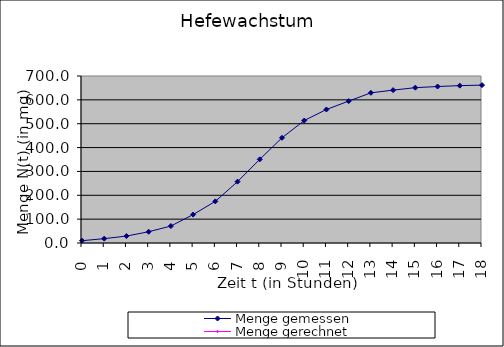
| Category | Menge gemessen | Menge gerechnet |
|---|---|---|
| 0.0 | 9.6 |  |
| 1.0 | 18.3 |  |
| 2.0 | 29 |  |
| 3.0 | 47.2 |  |
| 4.0 | 71.1 |  |
| 5.0 | 119.1 |  |
| 6.0 | 174.6 |  |
| 7.0 | 257.3 |  |
| 8.0 | 350.7 |  |
| 9.0 | 441 |  |
| 10.0 | 513.3 |  |
| 11.0 | 559.7 |  |
| 12.0 | 594.8 |  |
| 13.0 | 629.4 |  |
| 14.0 | 640.8 |  |
| 15.0 | 651.1 |  |
| 16.0 | 655.9 |  |
| 17.0 | 659.6 |  |
| 18.0 | 661.8 |  |